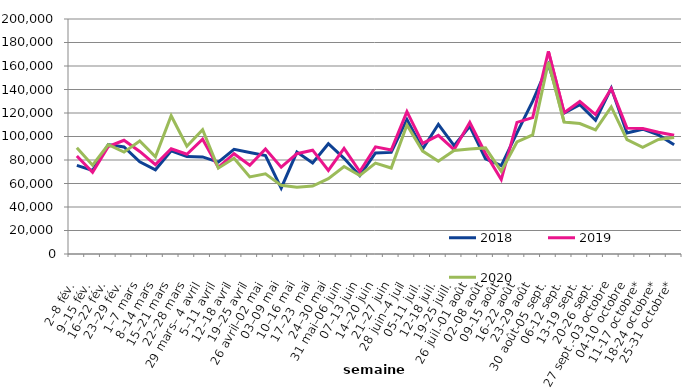
| Category | 2018 | 2019 | 2020 |
|---|---|---|---|
| 2–8 fév. | 75434 | 83347 | 90495 |
| 9–15 fév. | 71031 | 69559 | 75523 |
| 16–22 fév. | 93102 | 91428 | 93003 |
| 23–29 fév. | 91065 | 96774 | 86699 |
| 1–7 mars | 78415 | 87314 | 96119 |
| 8–14 mars | 71697 | 76021 | 82690 |
| 15–21 mars | 87845 | 89536 | 117673 |
| 22–28 mars | 82895 | 84912 | 91763.636 |
| 29 mars– 4 avril | 82654 | 97699 | 105802 |
| 5–11 avril | 78244 | 73699 | 73060.606 |
| 12–18 avril | 89129 | 85348 | 81477 |
| 19–25 avril | 86398 | 75509 | 65653 |
| 26 avril–02 mai | 83743 | 89413 | 68188 |
| 03–09 mai | 56008 | 73891 | 58423 |
| 10–16 mai | 86722 | 85364 | 56762 |
| 17–23  mai | 77423 | 88345 | 57817 |
| 24–30 mai | 93888 | 71115 | 64117 |
| 31 mai–06 juin | 81416 | 89880 | 74412 |
| 07–13 juin | 66658 | 70150 | 66851 |
| 14–20 juin | 86057 | 91157 | 77340 |
| 21–27 juin | 86474 | 88454 | 73165 |
| 28 juin–4 juil | 114502 | 121118 | 109774 |
| 05-11 juil. | 89389 | 94137 | 87596 |
| 12-18 juil. | 110384 | 100940 | 78915 |
| 19-25 juill. | 92231 | 88807 | 88097 |
| 26 juil.-01 août | 108699 | 112047 | 89418 |
| 02-08 août | 81067 | 85538 | 90304 |
| 09-15 août | 75229 | 63347 | 70433 |
| 16-22 août | 103158 | 111994 | 95333 |
| 23-29 août | 130053 | 116047 | 101359 |
| 30 août-05 sept. | 161020 | 172405 | 163439 |
| 06-12 sept. | 119903 | 120244 | 112241 |
| 13-19 sept. | 127142 | 129807 | 111025 |
| 20-26 sept. | 113803 | 118640 | 105627 |
| 27 sept.-03 octobre | 141252 | 140820 | 125188 |
| 04-10 octobre | 103071 | 107147 | 97408 |
| 11-17 octobre* | 106226 | 106842 | 90810 |
| 18-24 octobre* | 101349 | 103627 | 97529 |
| 25-31 octobre* | 92938 | 101052 | 99112 |